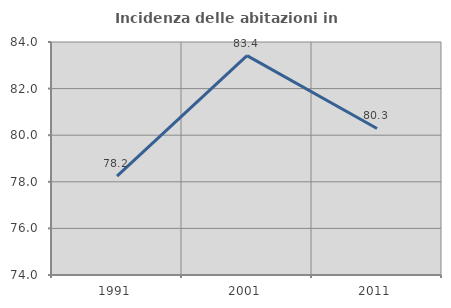
| Category | Incidenza delle abitazioni in proprietà  |
|---|---|
| 1991.0 | 78.241 |
| 2001.0 | 83.415 |
| 2011.0 | 80.288 |